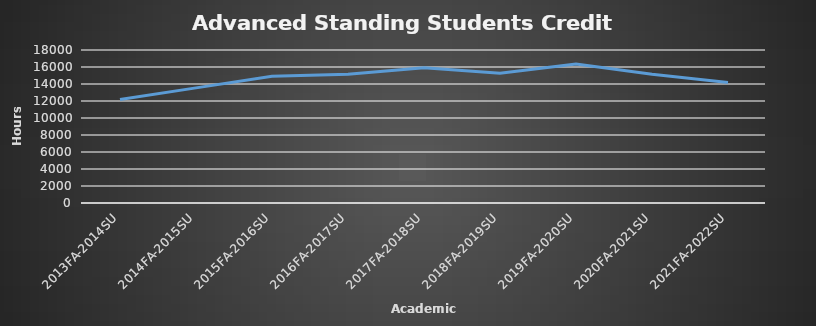
| Category | Hours |
|---|---|
| 2013FA-2014SU | 12177 |
| 2014FA-2015SU | 13543 |
| 2015FA-2016SU | 14921 |
| 2016FA-2017SU | 15155 |
| 2017FA-2018SU | 15905 |
| 2018FA-2019SU | 15279 |
| 2019FA-2020SU | 16351 |
| 2020FA-2021SU | 15142 |
| 2021FA-2022SU | 14165 |